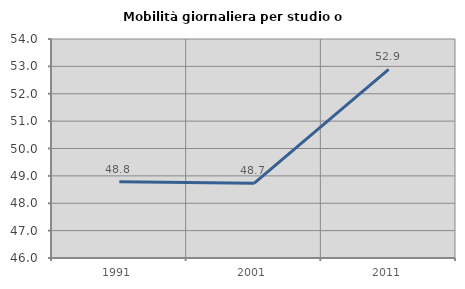
| Category | Mobilità giornaliera per studio o lavoro |
|---|---|
| 1991.0 | 48.789 |
| 2001.0 | 48.729 |
| 2011.0 | 52.89 |